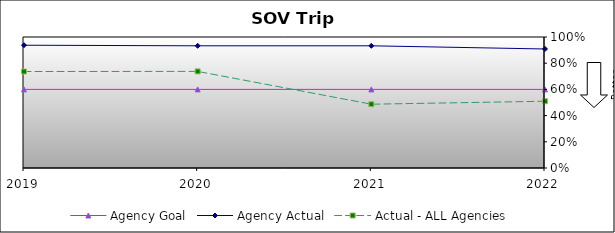
| Category | Agency Goal | Agency Actual | Actual - ALL Agencies |
|---|---|---|---|
| 2019.0 | 0.6 | 0.937 | 0.736 |
| 2020.0 | 0.6 | 0.933 | 0.737 |
| 2021.0 | 0.6 | 0.933 | 0.487 |
| 2022.0 | 0.6 | 0.908 | 0.509 |